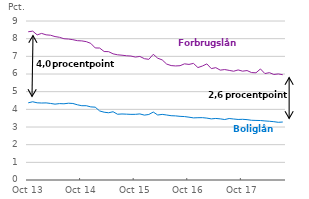
| Category | Boliglån | Forbrugslån |
|---|---|---|
| 2013-10-01 | 4.368 | 8.391 |
| 2013-11-01 | 4.429 | 8.426 |
| 2013-12-01 | 4.37 | 8.215 |
| 2014-01-01 | 4.357 | 8.298 |
| 2014-02-01 | 4.364 | 8.217 |
| 2014-03-01 | 4.333 | 8.195 |
| 2014-04-01 | 4.295 | 8.119 |
| 2014-05-01 | 4.324 | 8.077 |
| 2014-06-01 | 4.313 | 7.996 |
| 2014-07-01 | 4.347 | 7.979 |
| 2014-08-01 | 4.331 | 7.943 |
| 2014-09-01 | 4.258 | 7.887 |
| 2014-10-01 | 4.205 | 7.874 |
| 2014-11-01 | 4.205 | 7.831 |
| 2014-12-01 | 4.139 | 7.734 |
| 2015-01-01 | 4.122 | 7.475 |
| 2015-02-01 | 3.908 | 7.469 |
| 2015-03-01 | 3.837 | 7.272 |
| 2015-04-01 | 3.806 | 7.265 |
| 2015-05-01 | 3.865 | 7.142 |
| 2015-06-01 | 3.722 | 7.087 |
| 2015-07-01 | 3.737 | 7.063 |
| 2015-08-01 | 3.727 | 7.032 |
| 2015-09-01 | 3.715 | 7.016 |
| 2015-10-01 | 3.717 | 6.958 |
| 2015-11-01 | 3.741 | 6.993 |
| 2015-12-01 | 3.673 | 6.868 |
| 2016-01-01 | 3.708 | 6.829 |
| 2016-02-01 | 3.846 | 7.116 |
| 2016-03-01 | 3.679 | 6.894 |
| 2016-04-01 | 3.714 | 6.798 |
| 2016-05-01 | 3.679 | 6.562 |
| 2016-06-01 | 3.64 | 6.477 |
| 2016-07-01 | 3.63 | 6.456 |
| 2016-08-01 | 3.603 | 6.47 |
| 2016-09-01 | 3.59 | 6.575 |
| 2016-10-01 | 3.556 | 6.543 |
| 2016-11-01 | 3.516 | 6.6 |
| 2016-12-01 | 3.526 | 6.364 |
| 2017-01-01 | 3.529 | 6.451 |
| 2017-02-01 | 3.503 | 6.573 |
| 2017-03-01 | 3.459 | 6.306 |
| 2017-04-01 | 3.484 | 6.36 |
| 2017-05-01 | 3.462 | 6.219 |
| 2017-06-01 | 3.422 | 6.252 |
| 2017-07-01 | 3.481 | 6.205 |
| 2017-08-01 | 3.453 | 6.157 |
| 2017-09-01 | 3.426 | 6.231 |
| 2017-10-01 | 3.435 | 6.16 |
| 2017-11-01 | 3.417 | 6.195 |
| 2017-12-01 | 3.381 | 6.082 |
| 2018-01-01 | 3.372 | 6.068 |
| 2018-02-01 | 3.367 | 6.285 |
| 2018-03-01 | 3.344 | 6.024 |
| 2018-04-01 | 3.325 | 6.077 |
| 2018-05-01 | 3.301 | 5.974 |
| 2018-06-01 | 3.266 | 6.004 |
| 2018-07-01 | 3.282 | 5.959 |